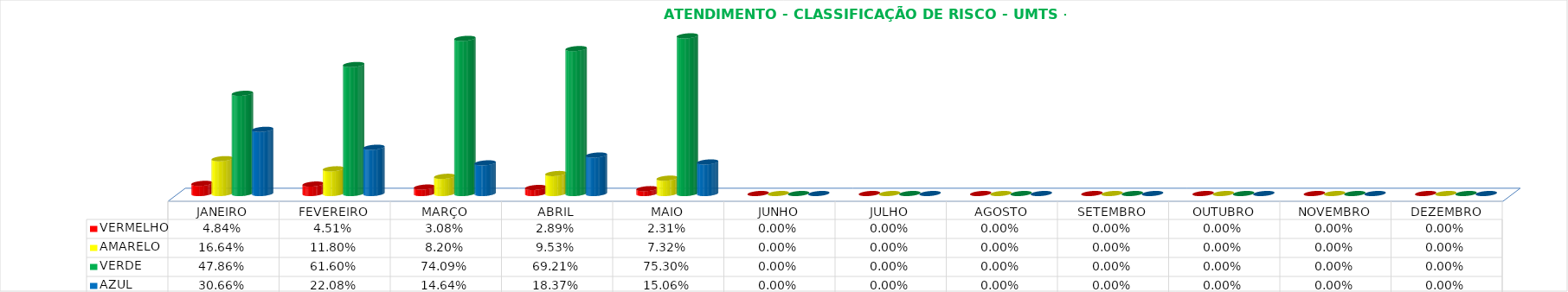
| Category | VERMELHO | AMARELO | VERDE | AZUL |
|---|---|---|---|---|
| JANEIRO | 0.048 | 0.166 | 0.479 | 0.307 |
| FEVEREIRO | 0.045 | 0.118 | 0.616 | 0.221 |
| MARÇO | 0.031 | 0.082 | 0.741 | 0.146 |
| ABRIL | 0.029 | 0.095 | 0.692 | 0.184 |
| MAIO | 0.023 | 0.073 | 0.753 | 0.151 |
| JUNHO | 0 | 0 | 0 | 0 |
| JULHO | 0 | 0 | 0 | 0 |
| AGOSTO | 0 | 0 | 0 | 0 |
| SETEMBRO | 0 | 0 | 0 | 0 |
| OUTUBRO | 0 | 0 | 0 | 0 |
| NOVEMBRO | 0 | 0 | 0 | 0 |
| DEZEMBRO | 0 | 0 | 0 | 0 |